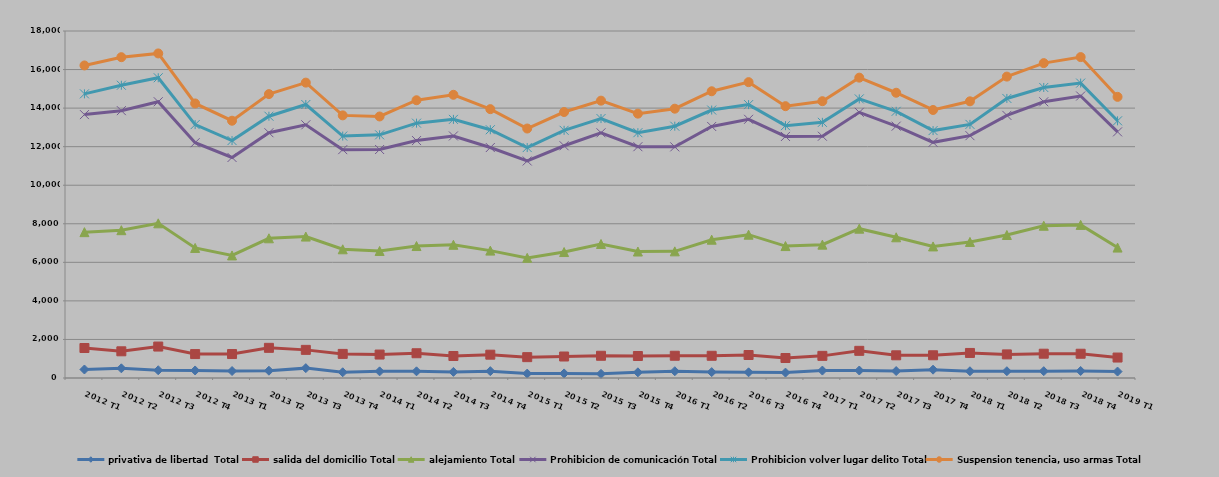
| Category | privativa de libertad  Total | salida del domicilio Total | alejamiento Total | Prohibicion de comunicación Total | Prohibicion volver lugar delito Total | Suspension tenencia, uso armas Total |
|---|---|---|---|---|---|---|
| 2012 T1 | 441 | 1115 | 6010 | 6097 | 1076 | 1474 |
| 2012 T2 | 502 | 883 | 6282 | 6201 | 1318 | 1456 |
| 2012 T3 | 402 | 1229 | 6393 | 6306 | 1244 | 1262 |
| 2012 T4 | 391 | 850 | 5505 | 5460 | 938 | 1097 |
| 2013 T1 | 362 | 881 | 5114 | 5082 | 878 | 1029 |
| 2013 T2 | 379 | 1186 | 5682 | 5476 | 857 | 1146 |
| 2013 T3 | 512 | 947 | 5877 | 5797 | 1053 | 1136 |
| 2013 T4 | 297 | 953 | 5427 | 5168 | 705 | 1073 |
| 2014 T1 | 344 | 873 | 5372 | 5264 | 760 | 953 |
| 2014 T2 | 347 | 937 | 5561 | 5471 | 903 | 1189 |
| 2014 T3 | 317 | 824 | 5769 | 5646 | 860 | 1275 |
| 2014 T4 | 355 | 855 | 5398 | 5347 | 923 | 1068 |
| 2015 T1 | 229 | 853 | 5150 | 5026 | 695 | 988 |
| 2015 T2 | 238 | 877 | 5419 | 5513 | 802 | 948 |
| 2015 T3 | 216 | 937 | 5800 | 5766 | 739 | 929 |
| 2015 T4 | 295 | 846 | 5420 | 5437 | 727 | 988 |
| 2016 T1 | 351 | 803 | 5416 | 5420 | 1072 | 908 |
| 2016 T2 | 306 | 846 | 6022 | 5873 | 852 | 975 |
| 2016 T3 | 295 | 898 | 6241 | 5985 | 762 | 1166 |
| 2016 T4 | 280 | 757 | 5807 | 5686 | 560 | 1010 |
| 2017 T1 | 385 | 763 | 5769 | 5625 | 720 | 1097 |
| 2017 T2 | 389 | 1020 | 6337 | 6036 | 695 | 1103 |
| 2017 T3 | 360 | 817 | 6122 | 5765 | 770 | 963 |
| 2017 T4 | 432 | 747 | 5646 | 5399 | 610 | 1069 |
| 2018 T1 | 350 | 950 | 5758 | 5513 | 585 | 1196 |
| 2018 T2 | 352 | 872 | 6194 | 6206 | 877 | 1133 |
| 2018 T3 | 354 | 906 | 6638 | 6430 | 743 | 1263 |
| 2018 T4 | 364 | 894 | 6685 | 6685 | 670 | 1349 |
| 2019 T1 | 334 | 727 | 5704 | 6003 | 573 | 1243 |